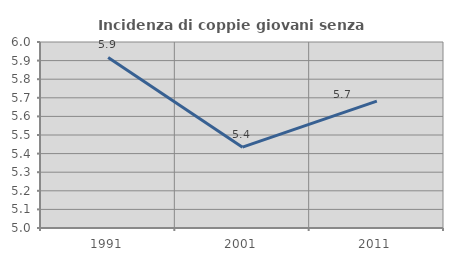
| Category | Incidenza di coppie giovani senza figli |
|---|---|
| 1991.0 | 5.917 |
| 2001.0 | 5.435 |
| 2011.0 | 5.682 |